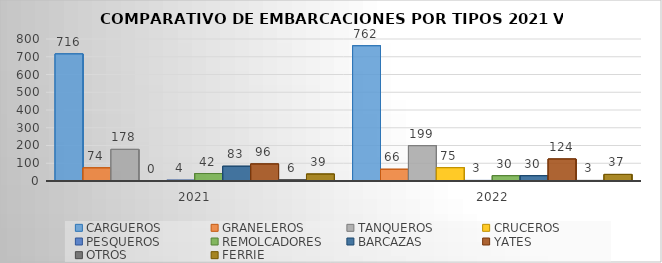
| Category | CARGUEROS | GRANELEROS | TANQUEROS | CRUCEROS | PESQUEROS | REMOLCADORES | BARCAZAS | YATES | OTROS | FERRIE |
|---|---|---|---|---|---|---|---|---|---|---|
| 2021.0 | 716 | 74 | 178 | 0 | 4 | 42 | 83 | 96 | 6 | 39 |
| 2022.0 | 762 | 66 | 199 | 75 | 3 | 30 | 30 | 124 | 3 | 37 |